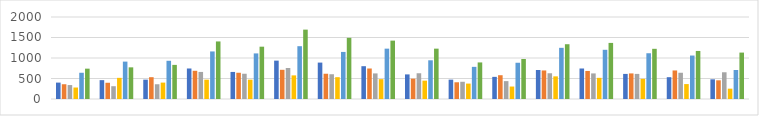
| Category | Series 0 | Series 1 | Series 2 | Series 3 | Series 4 | Series 5 |
|---|---|---|---|---|---|---|
| 7:00-8:00 | 400 | 360 | 340 | 280 | 640 | 740 |
| 8:00-9:00 | 460 | 396 | 312 | 516 | 912 | 772 |
| 9:00-10:00 | 472 | 532 | 360 | 400 | 932 | 832 |
| 10:00-11:00 | 744 | 688 | 660 | 472 | 1160 | 1404 |
| 11:00-12:00 | 660 | 640 | 616 | 472 | 1112 | 1276 |
| 12:00-13:00 | 936 | 712 | 756 | 576 | 1288 | 1692 |
| 13:00-14:00 | 888 | 616 | 604 | 532 | 1148 | 1492 |
| 14:00-15:00 | 800 | 744 | 624 | 484 | 1228 | 1424 |
| 15:00-16:00 | 600 | 496 | 628 | 448 | 944 | 1228 |
| 16:00-17:00 | 472 | 408 | 420 | 376 | 784 | 892 |
| 17:00-18:00 | 540 | 580 | 436 | 304 | 884 | 976 |
| 18:00-19:00 | 708 | 696 | 628 | 552 | 1248 | 1336 |
| 19:00-20:00 | 744 | 684 | 624 | 516 | 1200 | 1368 |
| 20:00-21:00 | 612 | 624 | 612 | 492 | 1116 | 1224 |
| 21:00-22:00 | 532 | 696 | 640 | 364 | 1060 | 1172 |
| 22:00-23:00 | 480 | 456 | 652 | 252 | 708 | 1132 |